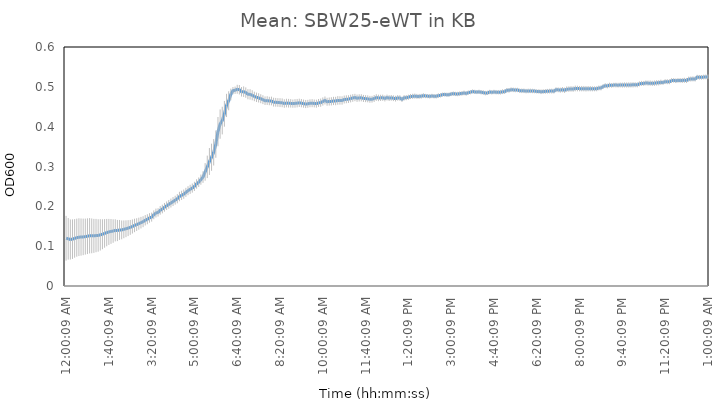
| Category | SBW25-eWT |
|---|---|
| 0.00010416666666666667 | 0.12 |
| 0.0035763888888888894 | 0.118 |
| 0.0070486111111111105 | 0.117 |
| 0.010520833333333333 | 0.118 |
| 0.013993055555555555 | 0.119 |
| 0.017465277777777777 | 0.121 |
| 0.020937499999999998 | 0.123 |
| 0.02440972222222222 | 0.123 |
| 0.027881944444444445 | 0.123 |
| 0.03135416666666666 | 0.124 |
| 0.034826388888888886 | 0.125 |
| 0.03829861111111111 | 0.126 |
| 0.04177083333333333 | 0.126 |
| 0.04524305555555556 | 0.126 |
| 0.04871527777777778 | 0.127 |
| 0.0521875 | 0.127 |
| 0.05565972222222223 | 0.128 |
| 0.059131944444444445 | 0.13 |
| 0.06260416666666667 | 0.132 |
| 0.06607638888888889 | 0.134 |
| 0.06954861111111112 | 0.136 |
| 0.07302083333333333 | 0.137 |
| 0.07649305555555556 | 0.138 |
| 0.07996527777777777 | 0.14 |
| 0.0834375 | 0.139 |
| 0.08690972222222222 | 0.141 |
| 0.09038194444444443 | 0.141 |
| 0.09385416666666667 | 0.142 |
| 0.09732638888888889 | 0.144 |
| 0.1007986111111111 | 0.145 |
| 0.10427083333333333 | 0.147 |
| 0.10774305555555556 | 0.149 |
| 0.11121527777777777 | 0.152 |
| 0.1146875 | 0.154 |
| 0.11815972222222222 | 0.156 |
| 0.12163194444444443 | 0.159 |
| 0.12510416666666666 | 0.161 |
| 0.1285763888888889 | 0.165 |
| 0.1320486111111111 | 0.168 |
| 0.13552083333333334 | 0.171 |
| 0.13899305555555555 | 0.173 |
| 0.14246527777777776 | 0.179 |
| 0.1459375 | 0.183 |
| 0.14940972222222224 | 0.185 |
| 0.15288194444444445 | 0.19 |
| 0.15635416666666666 | 0.193 |
| 0.1598263888888889 | 0.198 |
| 0.1632986111111111 | 0.201 |
| 0.16677083333333334 | 0.205 |
| 0.17024305555555555 | 0.208 |
| 0.17371527777777776 | 0.212 |
| 0.17718750000000003 | 0.215 |
| 0.18065972222222224 | 0.219 |
| 0.18413194444444445 | 0.225 |
| 0.18760416666666666 | 0.228 |
| 0.1910763888888889 | 0.231 |
| 0.1945486111111111 | 0.235 |
| 0.1980208333333333 | 0.239 |
| 0.20149305555555555 | 0.243 |
| 0.20496527777777776 | 0.246 |
| 0.20843750000000003 | 0.25 |
| 0.21190972222222224 | 0.256 |
| 0.21538194444444445 | 0.261 |
| 0.21885416666666668 | 0.267 |
| 0.2223263888888889 | 0.273 |
| 0.2257986111111111 | 0.286 |
| 0.2292708333333333 | 0.299 |
| 0.23274305555555555 | 0.313 |
| 0.23621527777777776 | 0.323 |
| 0.23968749999999997 | 0.336 |
| 0.24315972222222224 | 0.356 |
| 0.24663194444444445 | 0.388 |
| 0.2501041666666667 | 0.406 |
| 0.2535763888888889 | 0.415 |
| 0.2570486111111111 | 0.432 |
| 0.26052083333333337 | 0.453 |
| 0.2639930555555556 | 0.465 |
| 0.2674652777777778 | 0.481 |
| 0.27092592592592596 | 0.49 |
| 0.2744097222222222 | 0.491 |
| 0.2778819444444444 | 0.494 |
| 0.2813541666666666 | 0.493 |
| 0.2848263888888889 | 0.488 |
| 0.2882986111111111 | 0.488 |
| 0.29177083333333337 | 0.486 |
| 0.2952430555555556 | 0.481 |
| 0.2987152777777778 | 0.481 |
| 0.3021875 | 0.479 |
| 0.3056597222222222 | 0.476 |
| 0.3091319444444444 | 0.474 |
| 0.3126041666666666 | 0.472 |
| 0.3160763888888889 | 0.47 |
| 0.3195486111111111 | 0.468 |
| 0.3230208333333333 | 0.465 |
| 0.3264930555555556 | 0.465 |
| 0.3299652777777778 | 0.464 |
| 0.3334375 | 0.464 |
| 0.3369097222222222 | 0.462 |
| 0.3403819444444445 | 0.461 |
| 0.3438541666666666 | 0.461 |
| 0.3473263888888889 | 0.46 |
| 0.35079861111111116 | 0.46 |
| 0.3542708333333333 | 0.458 |
| 0.3577430555555556 | 0.459 |
| 0.3612152777777778 | 0.459 |
| 0.3646875 | 0.459 |
| 0.3681597222222222 | 0.458 |
| 0.3716319444444445 | 0.458 |
| 0.3751041666666666 | 0.459 |
| 0.3785763888888889 | 0.46 |
| 0.38204861111111116 | 0.459 |
| 0.3855208333333333 | 0.458 |
| 0.3889930555555556 | 0.457 |
| 0.3924652777777778 | 0.457 |
| 0.3959375 | 0.459 |
| 0.3994097222222222 | 0.459 |
| 0.4028819444444445 | 0.458 |
| 0.4063541666666666 | 0.458 |
| 0.4098263888888889 | 0.46 |
| 0.41329861111111116 | 0.46 |
| 0.4167708333333333 | 0.463 |
| 0.4202430555555556 | 0.466 |
| 0.4237152777777778 | 0.463 |
| 0.4271875 | 0.463 |
| 0.4306597222222222 | 0.464 |
| 0.4341319444444445 | 0.465 |
| 0.4376041666666666 | 0.464 |
| 0.4410763888888889 | 0.466 |
| 0.44454861111111116 | 0.466 |
| 0.4480208333333333 | 0.466 |
| 0.4514930555555556 | 0.468 |
| 0.4549652777777778 | 0.469 |
| 0.4584375 | 0.469 |
| 0.4619097222222222 | 0.471 |
| 0.4653819444444445 | 0.472 |
| 0.4688541666666666 | 0.473 |
| 0.4723263888888889 | 0.471 |
| 0.47579861111111116 | 0.472 |
| 0.4792708333333333 | 0.472 |
| 0.4827430555555556 | 0.471 |
| 0.4862152777777778 | 0.47 |
| 0.4896875 | 0.47 |
| 0.4931597222222222 | 0.469 |
| 0.4966319444444445 | 0.469 |
| 0.5001041666666667 | 0.471 |
| 0.5035763888888889 | 0.473 |
| 0.5070486111111111 | 0.472 |
| 0.5105208333333333 | 0.472 |
| 0.5139930555555555 | 0.473 |
| 0.5174652777777778 | 0.471 |
| 0.5209374999999999 | 0.473 |
| 0.5244097222222223 | 0.472 |
| 0.5278819444444445 | 0.472 |
| 0.5313541666666667 | 0.471 |
| 0.5348263888888889 | 0.47 |
| 0.5382986111111111 | 0.472 |
| 0.5417708333333333 | 0.472 |
| 0.5452430555555555 | 0.469 |
| 0.5487152777777778 | 0.472 |
| 0.5521874999999999 | 0.473 |
| 0.5556597222222223 | 0.474 |
| 0.5591319444444445 | 0.476 |
| 0.5626041666666667 | 0.476 |
| 0.5660763888888889 | 0.477 |
| 0.5695486111111111 | 0.476 |
| 0.5730208333333333 | 0.476 |
| 0.5764930555555555 | 0.476 |
| 0.5799652777777778 | 0.478 |
| 0.5834374999999999 | 0.477 |
| 0.5869097222222223 | 0.477 |
| 0.5903819444444445 | 0.476 |
| 0.5938541666666667 | 0.477 |
| 0.5973263888888889 | 0.476 |
| 0.6007986111111111 | 0.476 |
| 0.6042708333333333 | 0.478 |
| 0.6077430555555555 | 0.479 |
| 0.6112152777777778 | 0.48 |
| 0.6146874999999999 | 0.481 |
| 0.6181597222222223 | 0.48 |
| 0.6216319444444445 | 0.48 |
| 0.6251041666666667 | 0.482 |
| 0.6285763888888889 | 0.483 |
| 0.6320486111111111 | 0.482 |
| 0.6355208333333333 | 0.482 |
| 0.6389930555555555 | 0.483 |
| 0.6424652777777778 | 0.483 |
| 0.6459374999999999 | 0.485 |
| 0.6494097222222223 | 0.483 |
| 0.6528819444444445 | 0.485 |
| 0.6563541666666667 | 0.486 |
| 0.6598263888888889 | 0.488 |
| 0.6632986111111111 | 0.487 |
| 0.6667708333333334 | 0.487 |
| 0.6702430555555555 | 0.487 |
| 0.6737152777777777 | 0.486 |
| 0.6771875 | 0.486 |
| 0.6806597222222223 | 0.484 |
| 0.6841319444444444 | 0.485 |
| 0.6876041666666667 | 0.487 |
| 0.6910763888888889 | 0.486 |
| 0.6945486111111111 | 0.487 |
| 0.6980208333333334 | 0.487 |
| 0.7014930555555555 | 0.487 |
| 0.7049652777777777 | 0.486 |
| 0.7084375 | 0.488 |
| 0.7119097222222223 | 0.488 |
| 0.7153819444444444 | 0.491 |
| 0.7188541666666667 | 0.491 |
| 0.7223263888888889 | 0.493 |
| 0.7257986111111111 | 0.492 |
| 0.7292708333333334 | 0.492 |
| 0.7327430555555555 | 0.492 |
| 0.7362152777777777 | 0.49 |
| 0.7396875 | 0.49 |
| 0.7431597222222223 | 0.49 |
| 0.7466319444444444 | 0.489 |
| 0.7501041666666667 | 0.49 |
| 0.7535763888888889 | 0.49 |
| 0.7570486111111111 | 0.49 |
| 0.7605208333333334 | 0.489 |
| 0.7639930555555555 | 0.489 |
| 0.7674652777777777 | 0.488 |
| 0.7709375 | 0.488 |
| 0.7744097222222223 | 0.488 |
| 0.7778819444444444 | 0.488 |
| 0.7813541666666667 | 0.489 |
| 0.7848263888888889 | 0.489 |
| 0.7882986111111111 | 0.489 |
| 0.7917708333333334 | 0.489 |
| 0.7952430555555555 | 0.493 |
| 0.7987152777777777 | 0.492 |
| 0.8021875 | 0.492 |
| 0.8056597222222223 | 0.493 |
| 0.8091319444444444 | 0.491 |
| 0.8126041666666667 | 0.494 |
| 0.8160763888888889 | 0.494 |
| 0.8195486111111111 | 0.495 |
| 0.8230208333333334 | 0.494 |
| 0.8264930555555555 | 0.496 |
| 0.8299652777777777 | 0.496 |
| 0.8334375 | 0.495 |
| 0.8369097222222223 | 0.495 |
| 0.8403819444444444 | 0.495 |
| 0.8438541666666667 | 0.495 |
| 0.8473263888888889 | 0.495 |
| 0.8507986111111111 | 0.495 |
| 0.8542708333333334 | 0.495 |
| 0.8577430555555555 | 0.495 |
| 0.8612152777777777 | 0.495 |
| 0.8646875 | 0.497 |
| 0.8681597222222223 | 0.497 |
| 0.8716319444444444 | 0.501 |
| 0.8751041666666667 | 0.503 |
| 0.8785763888888889 | 0.502 |
| 0.8820486111111111 | 0.504 |
| 0.8855208333333334 | 0.504 |
| 0.8889930555555555 | 0.504 |
| 0.8924652777777777 | 0.504 |
| 0.8959375 | 0.504 |
| 0.8994097222222223 | 0.505 |
| 0.9028819444444444 | 0.504 |
| 0.9063541666666667 | 0.505 |
| 0.9098263888888889 | 0.505 |
| 0.9132986111111111 | 0.505 |
| 0.9167708333333334 | 0.505 |
| 0.9202430555555555 | 0.505 |
| 0.9237152777777777 | 0.505 |
| 0.9271875 | 0.505 |
| 0.9306597222222223 | 0.507 |
| 0.9341319444444444 | 0.509 |
| 0.9376041666666667 | 0.509 |
| 0.9410763888888889 | 0.51 |
| 0.9445486111111111 | 0.509 |
| 0.9480208333333334 | 0.509 |
| 0.9514930555555555 | 0.509 |
| 0.9549652777777777 | 0.509 |
| 0.9584375 | 0.51 |
| 0.9619097222222223 | 0.51 |
| 0.9653819444444444 | 0.511 |
| 0.9688541666666667 | 0.511 |
| 0.9723263888888889 | 0.513 |
| 0.9757986111111111 | 0.513 |
| 0.9792708333333334 | 0.513 |
| 0.9827430555555555 | 0.516 |
| 0.9862152777777777 | 0.516 |
| 0.9896875 | 0.515 |
| 0.9931597222222223 | 0.516 |
| 0.9966319444444444 | 0.516 |
| 1900-01-01 00:00:09 | 0.516 |
| 1900-01-01 00:05:09 | 0.516 |
| 1900-01-01 00:10:09 | 0.516 |
| 1900-01-01 00:15:09 | 0.519 |
| 1900-01-01 00:20:09 | 0.52 |
| 1900-01-01 00:25:09 | 0.52 |
| 1900-01-01 00:30:09 | 0.52 |
| 1900-01-01 00:35:09 | 0.524 |
| 1900-01-01 00:40:09 | 0.524 |
| 1900-01-01 00:45:09 | 0.524 |
| 1900-01-01 00:50:09 | 0.525 |
| 1900-01-01 00:55:09 | 0.525 |
| 1900-01-01 01:00:09 | 0.525 |